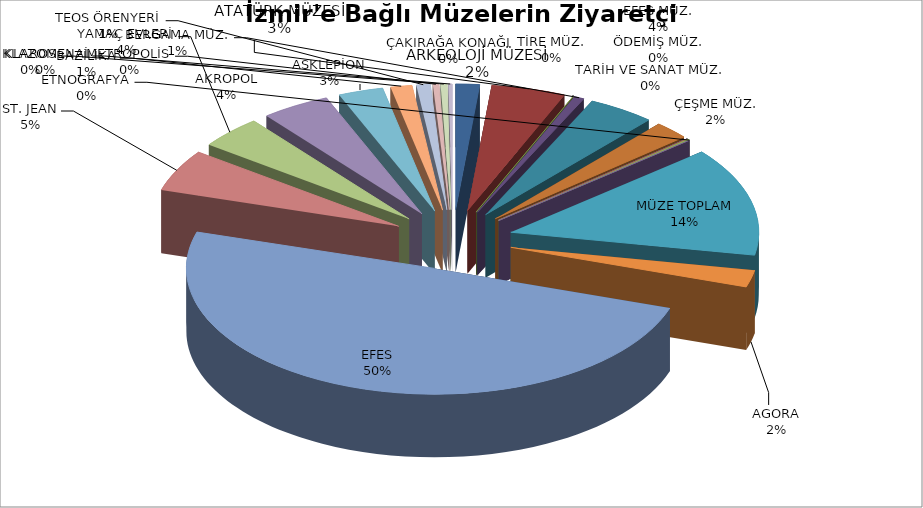
| Category | Series 0 |
|---|---|
| ARKEOLOJİ MÜZESİ | 36163 |
| ATATÜRK MÜZESİ | 112234 |
| TARİH VE SANAT MÜZ. | 235 |
| BERGAMA MÜZ. | 15381 |
| EFES MÜZ. | 101340 |
| ÇEŞME MÜZ. | 54066 |
| ÖDEMİŞ MÜZ. | 767 |
| TİRE MÜZ. | 0 |
| ÇAKIRAĞA KONAĞI | 4163 |
| ETNOGRAFYA | 0 |
| MÜZE TOPLAM | 324349 |
| AGORA | 50718 |
| EFES | 1151511 |
| ST. JEAN | 125039 |
| YAMAÇ EVLERİ | 97195 |
| AKROPOL | 104086 |
| ASKLEPİON | 67992 |
| BAZİLİKA | 32376 |
| TEOS ÖRENYERİ | 21067 |
| METROPOLİS | 9243 |
| KLAROS | 9831 |
| KLAZOMENAİ | 5621 |